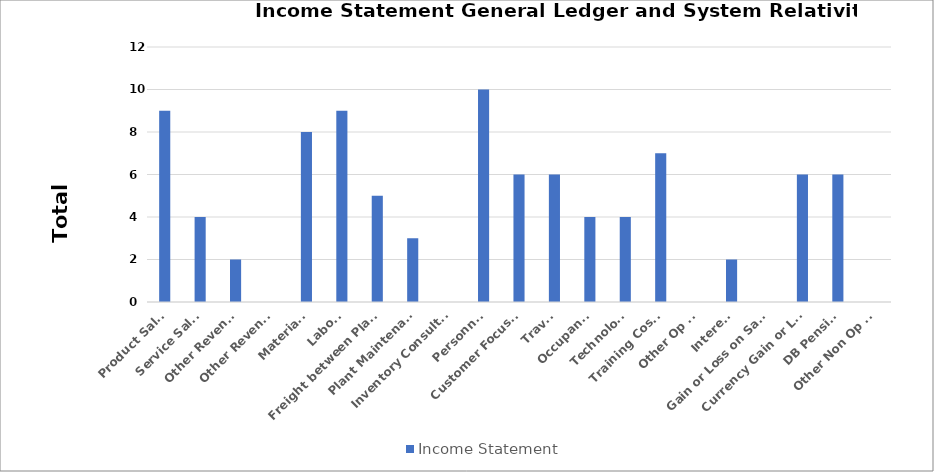
| Category | Income Statement |
|---|---|
| Product Sales  | 9 |
| Service Sales  | 4 |
| Other Revenue  | 2 |
| Other Revenue  | 0 |
| Materials  | 8 |
| Labor  | 9 |
| Freight between Plants  | 5 |
| Plant Maintenance  | 3 |
| Inventory Consultant  | 0 |
| Personnel  | 10 |
| Customer Focused  | 6 |
| Travel  | 6 |
| Occupancy  | 4 |
| Technology  | 4 |
| Training Costs  | 7 |
| Other Op Ex | 0 |
| Interest  | 2 |
| Gain or Loss on Sales  | 0 |
| Currency Gain or Loss  | 6 |
| DB Pension  | 6 |
| Other Non Op Ex  | 0 |